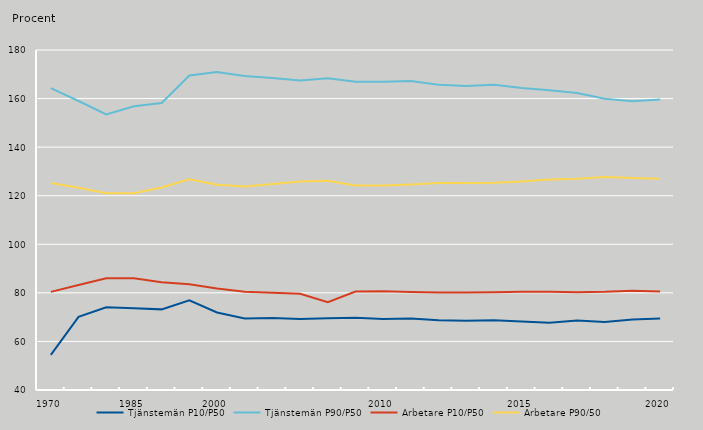
| Category | Tjänstemän P10/P50 | Tjänstemän P90/P50 | Arbetare P10/P50 | Arbetare P90/50 |
|---|---|---|---|---|
| 1970.0 | 54.5 | 164.3 | 80.4 | 125.2 |
| nan | 70.1 | 159 | 83.2 | 123.3 |
| nan | 74.1 | 153.5 | 86 | 121 |
| 1985.0 | 73.7 | 156.8 | 86 | 121 |
| nan | 73.2 | 158.2 | 84.4 | 123.4 |
| nan | 76.9 | 169.5 | 83.5 | 126.8 |
| 2000.0 | 71.9 | 170.9 | 81.8 | 124.5 |
| nan | 69.492 | 169.272 | 80.472 | 123.792 |
| nan | 69.6 | 168.5 | 80 | 124.8 |
| nan | 69.196 | 167.45 | 79.625 | 125.835 |
| nan | 69.5 | 168.4 | 76.2 | 126.2 |
| nan | 69.768 | 166.936 | 80.568 | 124.163 |
| 2010.0 | 69.227 | 166.88 | 80.695 | 124.156 |
| nan | 69.41 | 167.253 | 80.381 | 124.669 |
| nan | 68.765 | 165.661 | 80.182 | 125.198 |
| nan | 68.526 | 165.228 | 80.171 | 125.189 |
| nan | 68.747 | 165.734 | 80.265 | 125.293 |
| 2015.0 | 68.233 | 164.312 | 80.449 | 125.901 |
| nan | 67.683 | 163.462 | 80.47 | 126.713 |
| nan | 68.645 | 162.333 | 80.275 | 126.949 |
| nan | 68.033 | 159.922 | 80.435 | 127.693 |
| nan | 69.034 | 158.856 | 80.86 | 127.327 |
| 2020.0 | 69.404 | 159.653 | 80.546 | 127.015 |